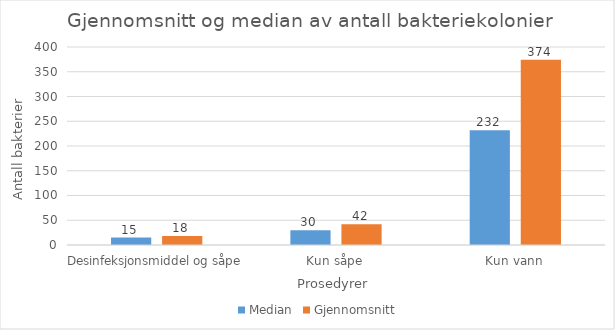
| Category | Median | Gjennomsnitt |
|---|---|---|
| Desinfeksjonsmiddel og såpe | 15 | 18 |
| Kun såpe | 30 | 42 |
| Kun vann | 232 | 374 |